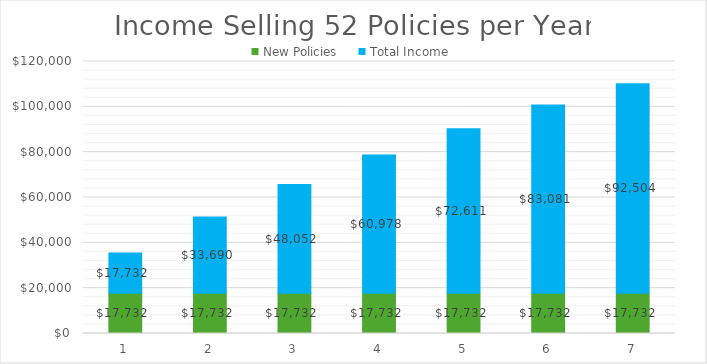
| Category | New Policies | Total Income |
|---|---|---|
| 1.0 | 17732 | 17732 |
| 2.0 | 17732 | 33690 |
| 3.0 | 17732 | 48052 |
| 4.0 | 17732 | 60978 |
| 5.0 | 17732 | 72611 |
| 6.0 | 17732 | 83081 |
| 7.0 | 17732 | 92504 |